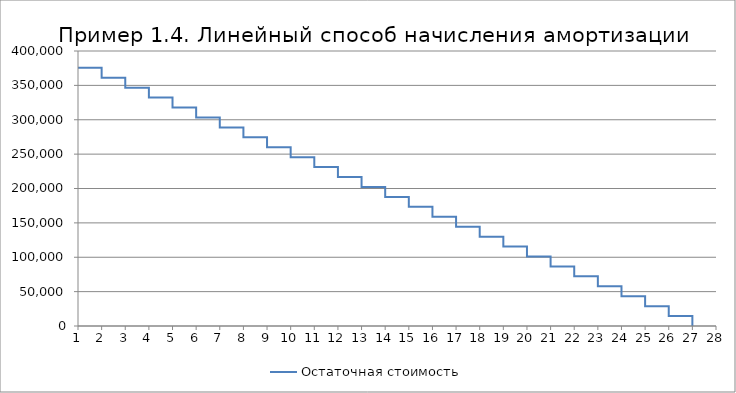
| Category | Остаточная стоимость |
|---|---|
| 1.0 | 375555.556 |
| 2.0 | 375555.556 |
| 2.0 | 361111.111 |
| 3.0 | 361111.111 |
| 3.0 | 346666.667 |
| 4.0 | 346666.667 |
| 4.0 | 332222.222 |
| 5.0 | 332222.222 |
| 5.0 | 317777.778 |
| 6.0 | 317777.778 |
| 6.0 | 303333.333 |
| 7.0 | 303333.333 |
| 7.0 | 288888.889 |
| 8.0 | 288888.889 |
| 8.0 | 274444.444 |
| 9.0 | 274444.444 |
| 9.0 | 260000 |
| 10.0 | 260000 |
| 10.0 | 245555.556 |
| 11.0 | 245555.556 |
| 11.0 | 231111.111 |
| 12.0 | 231111.111 |
| 12.0 | 216666.667 |
| 13.0 | 216666.667 |
| 13.0 | 202222.222 |
| 14.0 | 202222.222 |
| 14.0 | 187777.778 |
| 15.0 | 187777.778 |
| 15.0 | 173333.333 |
| 16.0 | 173333.333 |
| 16.0 | 158888.889 |
| 17.0 | 158888.889 |
| 17.0 | 144444.444 |
| 18.0 | 144444.444 |
| 18.0 | 130000 |
| 19.0 | 130000 |
| 19.0 | 115555.556 |
| 20.0 | 115555.556 |
| 20.0 | 101111.111 |
| 21.0 | 101111.111 |
| 21.0 | 86666.667 |
| 22.0 | 86666.667 |
| 22.0 | 72222.222 |
| 23.0 | 72222.222 |
| 23.0 | 57777.778 |
| 24.0 | 57777.778 |
| 24.0 | 43333.333 |
| 25.0 | 43333.333 |
| 25.0 | 28888.889 |
| 26.0 | 28888.889 |
| 26.0 | 14444.444 |
| 27.0 | 14444.444 |
| 27.0 | 0 |